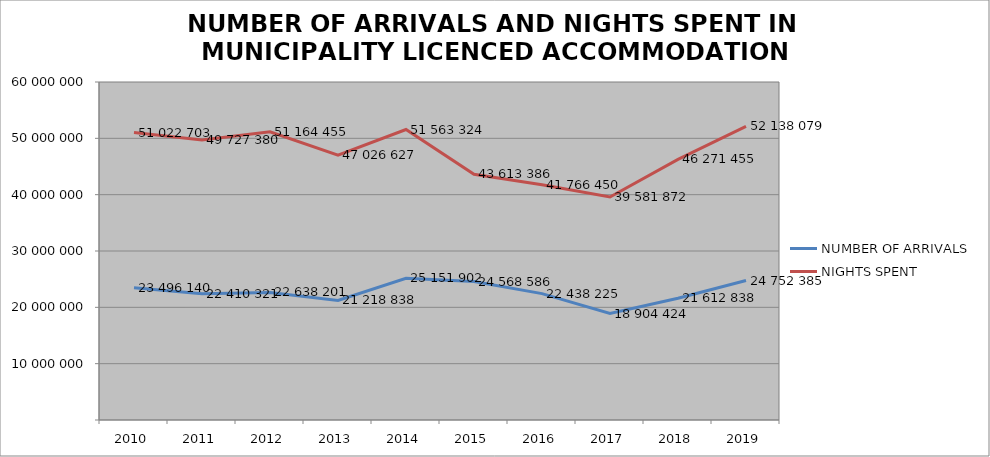
| Category | NUMBER OF ARRIVALS | NIGHTS SPENT |
|---|---|---|
| 2010 | 23496140 | 51022703 |
| 2011 | 22410321 | 49727380 |
| 2012 | 22638201 | 51164455 |
| 2013 | 21218838 | 47026627 |
| 2014 | 25151902 | 51563324 |
| 2015 | 24568586 | 43613386 |
| 2016 | 22438225 | 41766450 |
| 2017 | 18904424 | 39581872 |
| 2018 | 21612838 | 46271455 |
| 2019 | 24752385 | 52138079 |